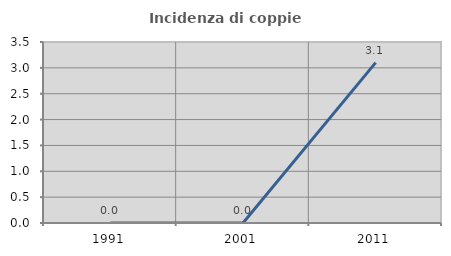
| Category | Incidenza di coppie miste |
|---|---|
| 1991.0 | 0 |
| 2001.0 | 0 |
| 2011.0 | 3.101 |